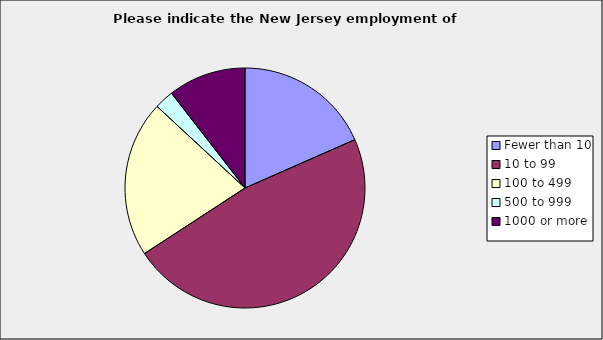
| Category | Series 0 |
|---|---|
| Fewer than 10 | 0.184 |
| 10 to 99 | 0.474 |
| 100 to 499 | 0.211 |
| 500 to 999 | 0.026 |
| 1000 or more | 0.105 |